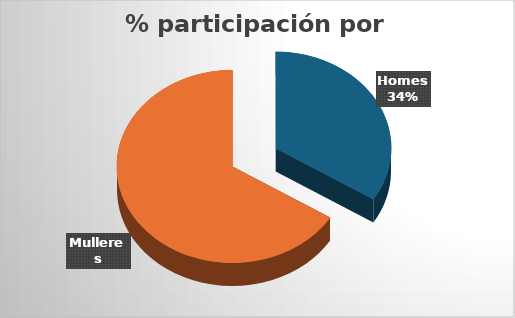
| Category | Series 0 |
|---|---|
| Homes | 39 |
| Mulleres | 76 |